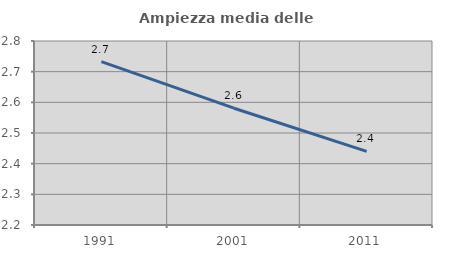
| Category | Ampiezza media delle famiglie |
|---|---|
| 1991.0 | 2.733 |
| 2001.0 | 2.581 |
| 2011.0 | 2.44 |